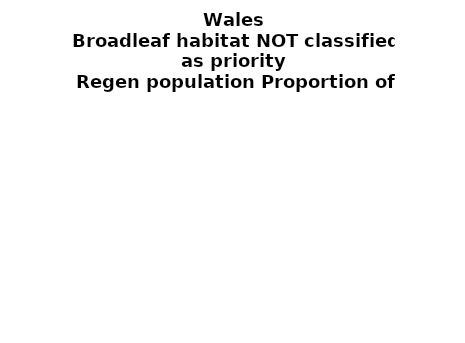
| Category | Broadleaf habitat NOT classified as priority |
|---|---|
| None | 0.047 |
| Seedlings only | 0 |
| Seedlings, saplings only | 0.081 |
| Seedlings, saplings, <7 cm trees | 0.155 |
| Saplings only | 0.184 |
| <7 cm trees, seedlings only | 0 |
| <7 cm trees, saplings only | 0.528 |
| <7 cm Trees only | 0.004 |